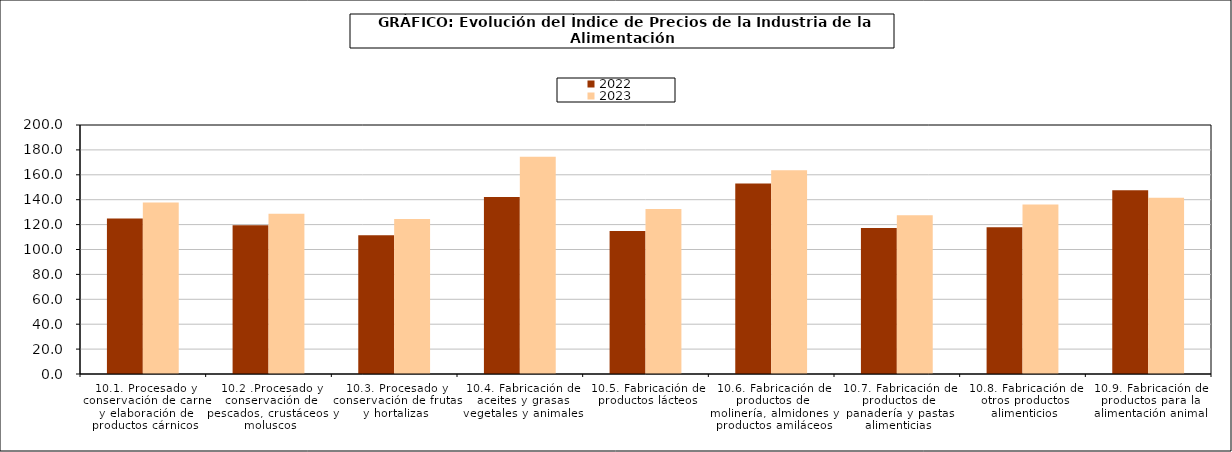
| Category | 2022 | 2023 |
|---|---|---|
| 10.1. Procesado y conservación de carne y elaboración de productos cárnicos | 124.881 | 137.655 |
| 10.2 .Procesado y conservación de pescados, crustáceos y moluscos | 119.457 | 128.677 |
| 10.3. Procesado y conservación de frutas y hortalizas | 111.358 | 124.591 |
| 10.4. Fabricación de aceites y grasas vegetales y animales | 142.193 | 174.497 |
| 10.5. Fabricación de productos lácteos | 114.854 | 132.48 |
| 10.6. Fabricación de productos de molinería, almidones y productos amiláceos | 152.914 | 163.572 |
| 10.7. Fabricación de productos de panadería y pastas alimenticias | 117.232 | 127.447 |
| 10.8. Fabricación de otros productos alimenticios | 117.849 | 136.116 |
| 10.9. Fabricación de productos para la alimentación animal | 147.513 | 141.62 |